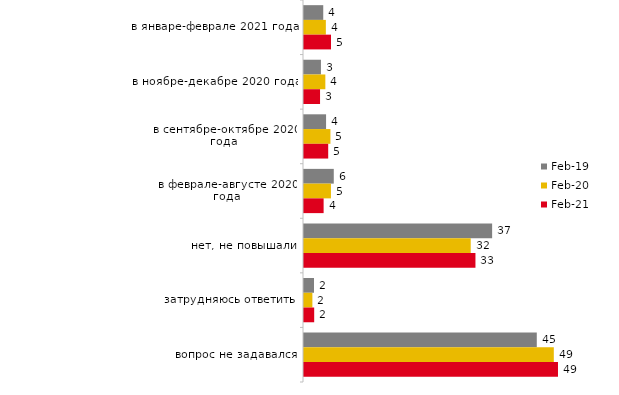
| Category | фев.19 | фев.20 | фев.21 |
|---|---|---|---|
| в январе-феврале 2021 года | 3.75 | 4.257 | 5.261 |
| в ноябре-декабре 2020 года | 3.3 | 4.158 | 3.127 |
| в сентябре-октябре 2020 года | 4.3 | 5.149 | 4.715 |
| в феврале-августе 2020 года | 5.8 | 5.248 | 3.821 |
| нет, не повышали | 36.65 | 32.475 | 33.4 |
| затрудняюсь ответить | 1.95 | 1.634 | 1.985 |
| вопрос не задавался | 45.35 | 48.663 | 49.479 |